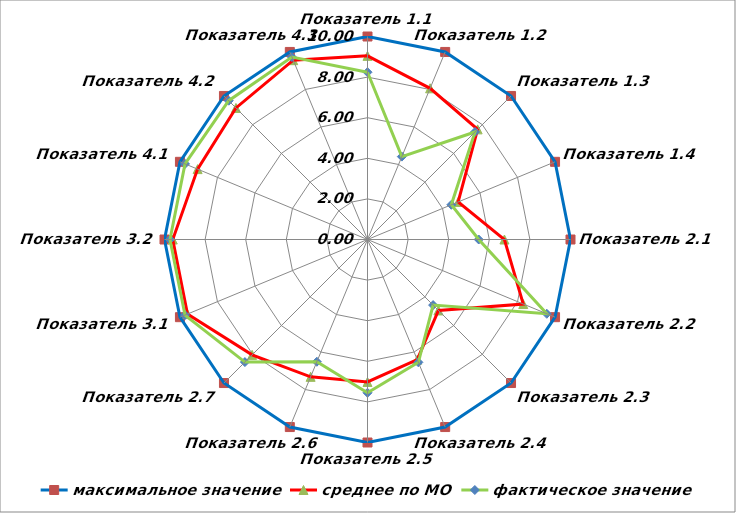
| Category | максимальное значение | среднее по МО | фактическое значение |
|---|---|---|---|
| Показатель 1.1 | 10 | 9.046 | 8.24 |
| Показатель 1.2 | 10 | 8.061 | 4.42 |
| Показатель 1.3 | 10 | 7.673 | 7.49 |
| Показатель 1.4 | 10 | 4.833 | 4.47 |
| Показатель 2.1 | 10 | 6.745 | 5.48 |
| Показатель 2.2 | 10 | 8.305 | 9.56 |
| Показатель 2.3 | 10 | 4.943 | 4.57 |
| Показатель 2.4 | 10 | 6.405 | 6.55 |
| Показатель 2.5 | 10 | 7.017 | 7.55 |
| Показатель 2.6 | 10 | 7.323 | 6.52 |
| Показатель 2.7 | 10 | 8.039 | 8.54 |
| Показатель 3.1 | 10 | 9.599 | 9.73 |
| Показатель 3.2 | 10 | 9.593 | 9.73 |
| Показатель 4.1 | 10 | 9.059 | 9.73 |
| Показатель 4.2 | 10 | 9.164 | 9.67 |
| Показатель 4.3 | 10 | 9.561 | 9.73 |